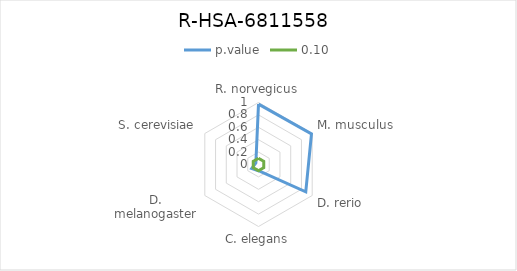
| Category | p.value | 0.10 |
|---|---|---|
| R. norvegicus | 0.974 | 0.1 |
| M. musculus | 0.987 | 0.1 |
| D. rerio | 0.88 | 0.1 |
| C. elegans | 0.1 | 0.1 |
| D. melanogaster | 0.125 | 0.1 |
| S. cerevisiae | 0.049 | 0.1 |